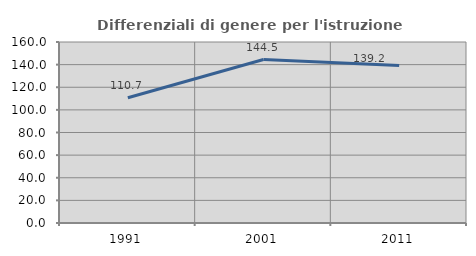
| Category | Differenziali di genere per l'istruzione superiore |
|---|---|
| 1991.0 | 110.731 |
| 2001.0 | 144.502 |
| 2011.0 | 139.238 |